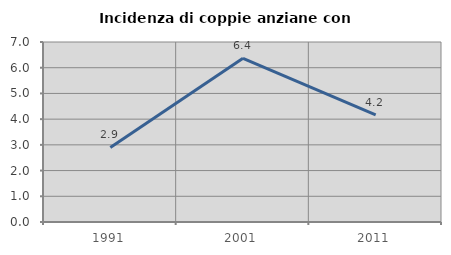
| Category | Incidenza di coppie anziane con figli |
|---|---|
| 1991.0 | 2.899 |
| 2001.0 | 6.364 |
| 2011.0 | 4.167 |